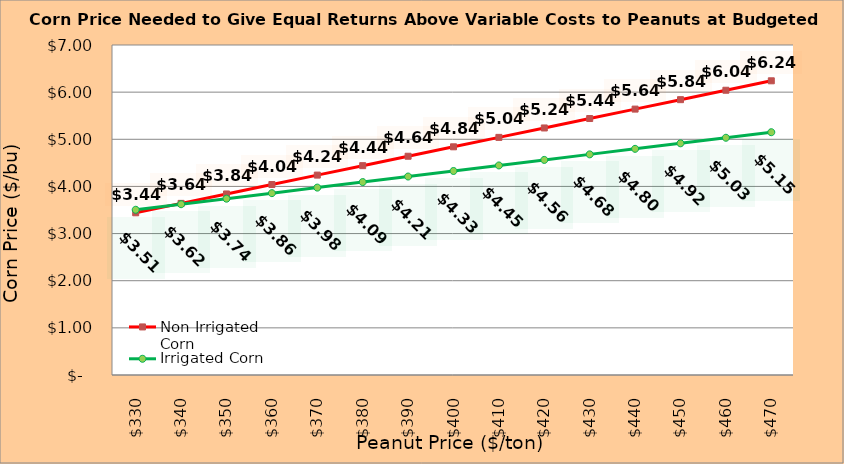
| Category | Non Irrigated Corn | Irrigated Corn |
|---|---|---|
| 330.0 | 3.44 | 3.505 |
| 340.0 | 3.64 | 3.623 |
| 350.0 | 3.84 | 3.74 |
| 360.0 | 4.04 | 3.858 |
| 370.0 | 4.24 | 3.975 |
| 380.0 | 4.44 | 4.093 |
| 390.0 | 4.64 | 4.21 |
| 400.0 | 4.84 | 4.328 |
| 410.0 | 5.04 | 4.445 |
| 420.0 | 5.24 | 4.563 |
| 430.0 | 5.44 | 4.68 |
| 440.0 | 5.64 | 4.798 |
| 450.0 | 5.84 | 4.915 |
| 460.0 | 6.04 | 5.033 |
| 470.0 | 6.24 | 5.15 |